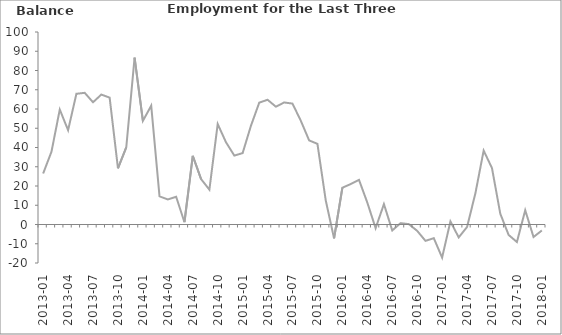
| Category | Balance |
|---|---|
| 2013-01 | 26.5 |
|  | 37.8 |
|  | 59.7 |
| 2013-04 | 49 |
|  | 67.9 |
|  | 68.4 |
| 2013-07 | 63.5 |
|  | 67.5 |
|  | 65.9 |
| 2013-10 | 29.2 |
|  | 40.1 |
|  | 86.7 |
| 2014-01 | 53.8 |
|  | 61.7 |
|  | 14.6 |
| 2014-04 | 13 |
|  | 14.4 |
|  | 1.2 |
| 2014-07 | 35.7 |
|  | 23.6 |
|  | 18.1 |
| 2014-10 | 52.2 |
|  | 42.7 |
|  | 35.8 |
| 2015-01 | 37.1 |
|  | 51.3 |
|  | 63.3 |
| 2015-04 | 64.8 |
|  | 61.2 |
|  | 63.4 |
| 2015-07 | 62.8 |
|  | 53.9 |
|  | 43.7 |
| 2015-10 | 41.9 |
|  | 12.5 |
|  | -7.2 |
| 2016-01 | 19.1 |
|  | 21 |
|  | 23.2 |
| 2016-04 | 11.4 |
|  | -1.9 |
|  | 10.6 |
| 2016-07 | -3.1 |
|  | 0.7 |
|  | 0.2 |
| 2016-10 | -3.3 |
|  | -8.5 |
|  | -7.1 |
| 2017-01 | -17.2 |
|  | 1.6 |
|  | -6.7 |
| 2017-04 | -1.3 |
|  | 16.1 |
|  | 38.4 |
| 2017-07 | 29.3 |
|  | 5.6 |
|  | -5.4 |
| 2017-10 | -9.1 |
|  | 7.4 |
|  | -6.5 |
| 2018-01 | -3.1 |